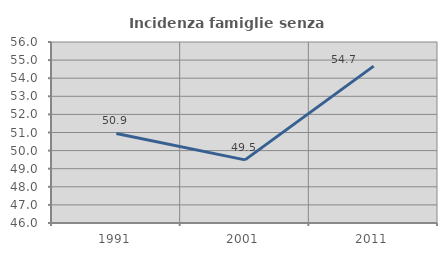
| Category | Incidenza famiglie senza nuclei |
|---|---|
| 1991.0 | 50.949 |
| 2001.0 | 49.488 |
| 2011.0 | 54.667 |